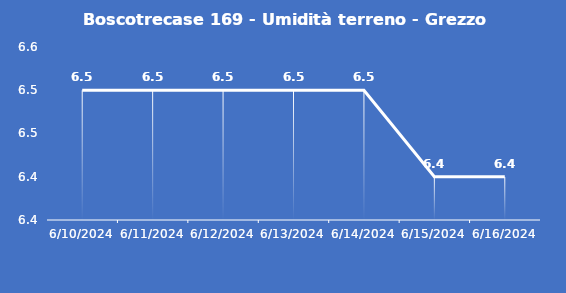
| Category | Boscotrecase 169 - Umidità terreno - Grezzo (%VWC) |
|---|---|
| 6/10/24 | 6.5 |
| 6/11/24 | 6.5 |
| 6/12/24 | 6.5 |
| 6/13/24 | 6.5 |
| 6/14/24 | 6.5 |
| 6/15/24 | 6.4 |
| 6/16/24 | 6.4 |